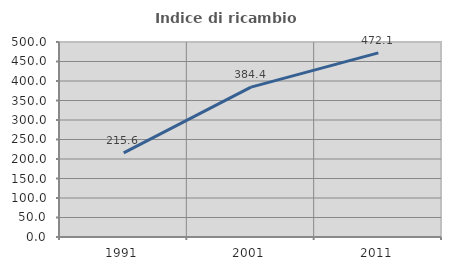
| Category | Indice di ricambio occupazionale  |
|---|---|
| 1991.0 | 215.584 |
| 2001.0 | 384.393 |
| 2011.0 | 472.093 |